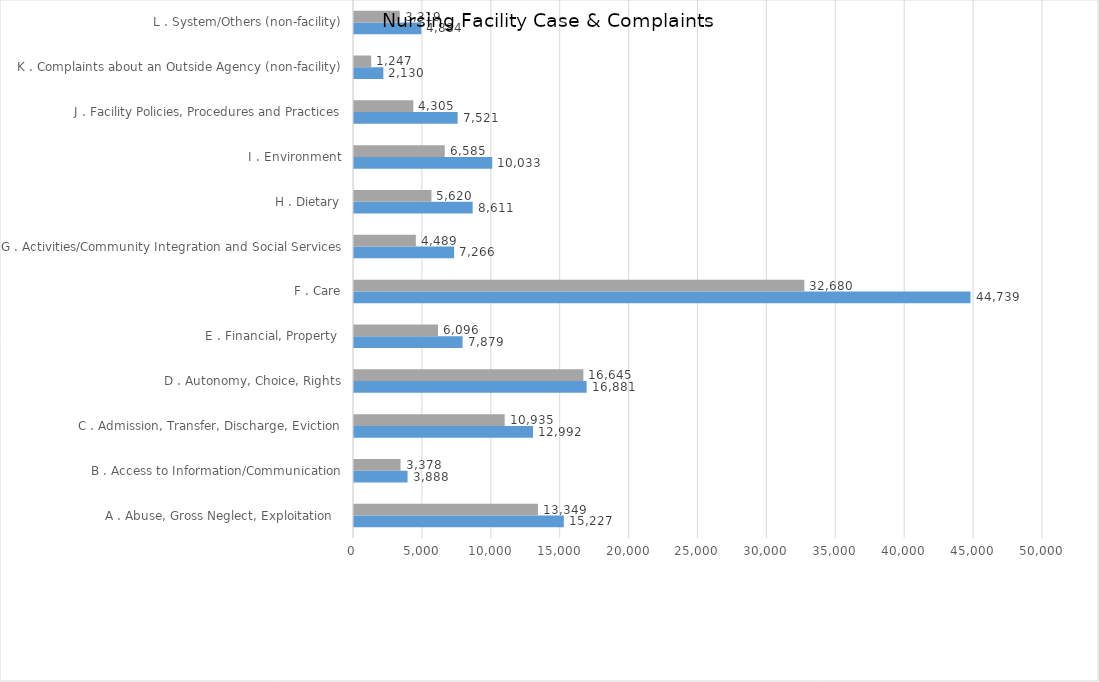
| Category | Nursing Facility 
FFY 2019 | Nursing Facility 
FFY 2020 |
|---|---|---|
| A . Abuse, Gross Neglect, Exploitation   | 15227 | 13349 |
| B . Access to Information/Communication | 3888 | 3378 |
| C . Admission, Transfer, Discharge, Eviction | 12992 | 10935 |
| D . Autonomy, Choice, Rights | 16881 | 16645 |
| E . Financial, Property  | 7879 | 6096 |
| F . Care | 44739 | 32680 |
| G . Activities/Community Integration and Social Services | 7266 | 4489 |
| H . Dietary | 8611 | 5620 |
| I . Environment | 10033 | 6585 |
| J . Facility Policies, Procedures and Practices | 7521 | 4305 |
| K . Complaints about an Outside Agency (non-facility) | 2130 | 1247 |
| L . System/Others (non-facility) | 4884 | 3319 |